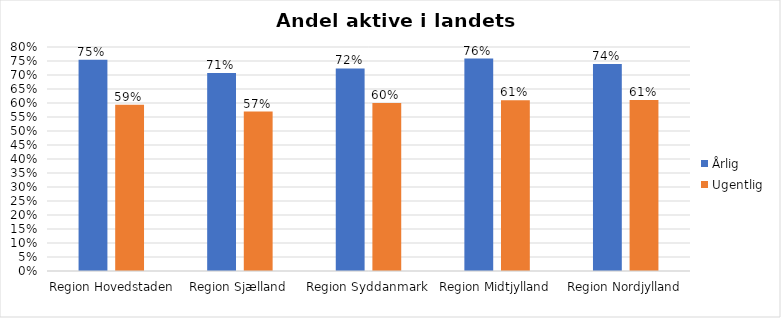
| Category | Årlig | Ugentlig |
|---|---|---|
| Region Hovedstaden | 0.755 | 0.594 |
| Region Sjælland | 0.707 | 0.57 |
| Region Syddanmark | 0.723 | 0.6 |
| Region Midtjylland | 0.759 | 0.61 |
| Region Nordjylland | 0.74 | 0.611 |